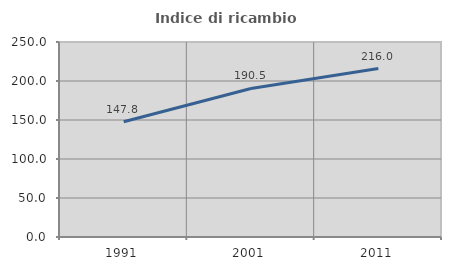
| Category | Indice di ricambio occupazionale  |
|---|---|
| 1991.0 | 147.826 |
| 2001.0 | 190.476 |
| 2011.0 | 216 |